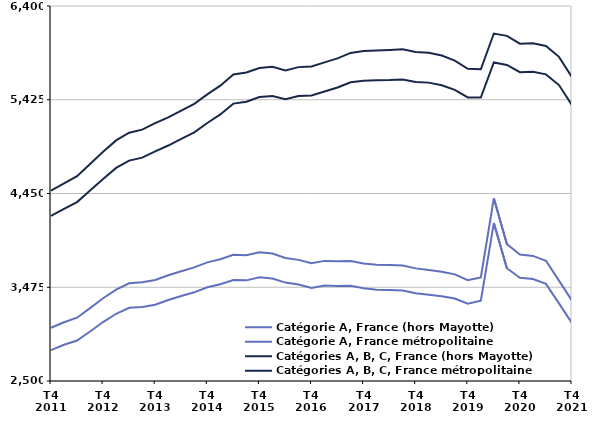
| Category | Catégorie A, France (hors Mayotte) | Catégorie A, France métropolitaine | Catégories A, B, C, France (hors Mayotte) | Catégories A, B, C, France métropolitaine |
|---|---|---|---|---|
| T4
2011 | 3053.8 | 2821.4 | 4480.5 | 4217.6 |
| T1
2012 | 3111.4 | 2876.4 | 4556.5 | 4290.3 |
| T2
2012 | 3158.4 | 2920.8 | 4630.7 | 4360.7 |
| T3
2012 | 3257.4 | 3015.3 | 4756.3 | 4480.8 |
| T4
2012 | 3360.9 | 3113 | 4883 | 4600.9 |
| T1
2013 | 3450.6 | 3199.2 | 5002.2 | 4716.3 |
| T2
2013 | 3516.7 | 3260.9 | 5082.7 | 4791.9 |
| T3
2013 | 3526.2 | 3270.1 | 5114 | 4822.9 |
| T4
2013 | 3550.8 | 3293.8 | 5181.5 | 4888.7 |
| T1
2014 | 3599.5 | 3343 | 5242 | 4948.8 |
| T2
2014 | 3641.9 | 3383.7 | 5312.3 | 5017.1 |
| T3
2014 | 3681.3 | 3422.1 | 5382.6 | 5085.7 |
| T4
2014 | 3734 | 3474.8 | 5480.7 | 5182.8 |
| T1
2015 | 3766 | 3506.1 | 5571.7 | 5272.2 |
| T2
2015 | 3812.9 | 3550.5 | 5688.4 | 5384.8 |
| T3
2015 | 3808.8 | 3546.7 | 5709 | 5404.8 |
| T4
2015 | 3838.1 | 3577.7 | 5755.8 | 5452.5 |
| T1
2016 | 3825.3 | 3565.5 | 5767.1 | 5464 |
| T2
2016 | 3779.3 | 3523.3 | 5730 | 5430.7 |
| T3
2016 | 3759.7 | 3504 | 5764.3 | 5464.3 |
| T4
2016 | 3724.6 | 3468.4 | 5771.7 | 5470.4 |
| T1
2017 | 3749.2 | 3492.3 | 5813.4 | 5511.3 |
| T2
2017 | 3744.8 | 3488.6 | 5855.1 | 5552.5 |
| T3
2017 | 3746.9 | 3489.6 | 5911.8 | 5606.6 |
| T4
2017 | 3723 | 3464 | 5931 | 5622.8 |
| T1
2018 | 3708.6 | 3448.7 | 5936.5 | 5626.6 |
| T2
2018 | 3706.6 | 3445.4 | 5942.3 | 5629.4 |
| T3
2018 | 3702 | 3441.1 | 5949.2 | 5636.1 |
| T4
2018 | 3671.2 | 3412.7 | 5922.2 | 5610.7 |
| T1
2019 | 3654.9 | 3397.5 | 5914.3 | 5603.1 |
| T2
2019 | 3636.3 | 3381.2 | 5884.6 | 5576.3 |
| T3
2019 | 3609.2 | 3357.3 | 5832.2 | 5527.4 |
| T4
2019 | 3549.3 | 3303.9 | 5747.1 | 5449.2 |
| T1
2020 | 3576.6 | 3334.2 | 5742 | 5448.2 |
| T2
2020 | 4400.8 | 4142.7 | 6113.9 | 5813.3 |
| T3
2020 | 3923.9 | 3673.2 | 6089.3 | 5787.1 |
| T4
2020 | 3815.2 | 3572.8 | 6008.4 | 5712.2 |
| T1
2021 | 3800.7 | 3560.6 | 6012.6 | 5716.9 |
| T2
2021 | 3750.1 | 3510.5 | 5984 | 5688.7 |
| T3
2021 | 3544.1 | 3307.4 | 5871.2 | 5577.8 |
| T4
2021 | 3335.6 | 3101.8 | 5658.9 | 5368.2 |